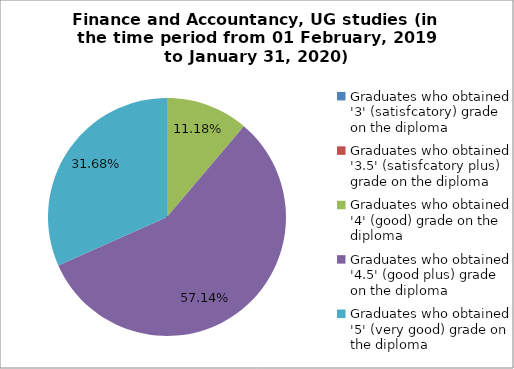
| Category | Series 0 |
|---|---|
| Graduates who obtained '3' (satisfcatory) grade on the diploma | 0 |
| Graduates who obtained '3.5' (satisfcatory plus) grade on the diploma | 0 |
| Graduates who obtained '4' (good) grade on the diploma | 11.18 |
| Graduates who obtained '4.5' (good plus) grade on the diploma | 57.143 |
| Graduates who obtained '5' (very good) grade on the diploma | 31.677 |